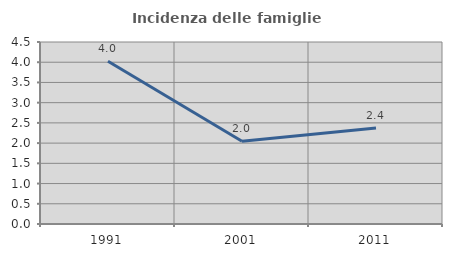
| Category | Incidenza delle famiglie numerose |
|---|---|
| 1991.0 | 4.022 |
| 2001.0 | 2.048 |
| 2011.0 | 2.375 |